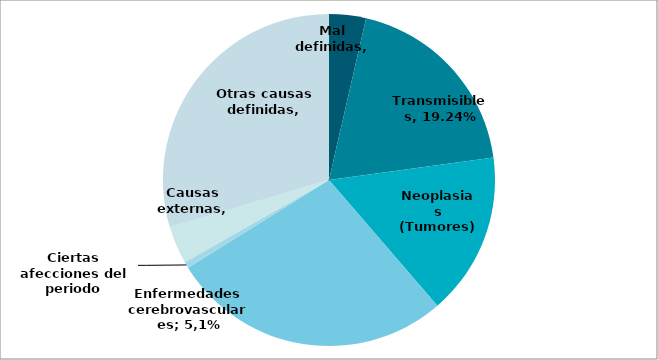
| Category | Series 0 |
|---|---|
| Mal definidas | 0.036 |
| Transmisibles | 0.192 |
| Neoplasias (Tumores) | 0.158 |
| Enfermedades del sistema circulatorio | 0.275 |
| Ciertas afecciones del periodo perinatal | 0.006 |
| Causas externas | 0.037 |
| Otras causas definidas | 0.296 |